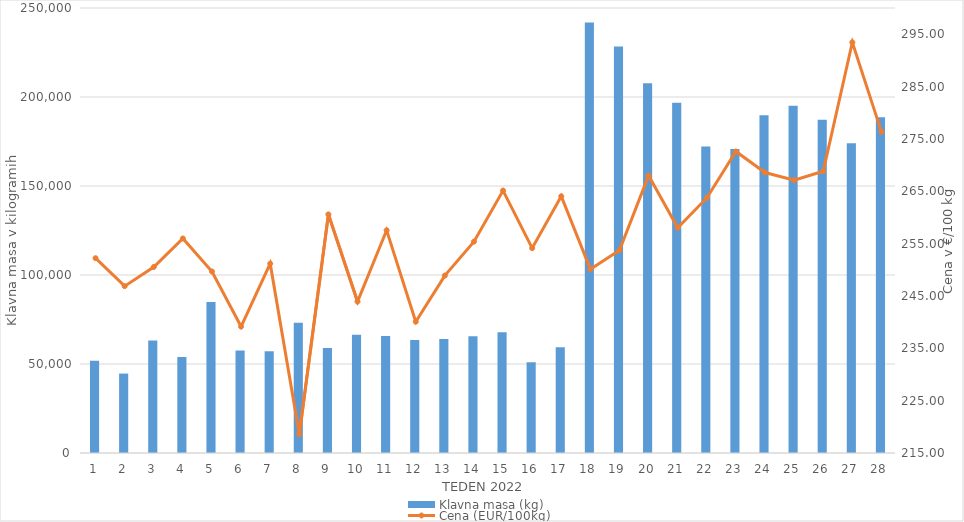
| Category | Klavna masa (kg) |
|---|---|
| 1.0 | 51818 |
| 2.0 | 44619 |
| 3.0 | 63233 |
| 4.0 | 53993 |
| 5.0 | 84871 |
| 6.0 | 57648 |
| 7.0 | 57159 |
| 8.0 | 73139 |
| 9.0 | 59056 |
| 10.0 | 66417 |
| 11.0 | 65723 |
| 12.0 | 63530 |
| 13.0 | 64069 |
| 14.0 | 65564 |
| 15.0 | 67787 |
| 16.0 | 50958 |
| 17.0 | 59387 |
| 18.0 | 241833 |
| 19.0 | 228389 |
| 20.0 | 207661 |
| 21.0 | 196732 |
| 22.0 | 172190 |
| 23.0 | 170751 |
| 24.0 | 189775 |
| 25.0 | 195029 |
| 26.0 | 187239 |
| 27.0 | 173967 |
| 28.0 | 188601 |